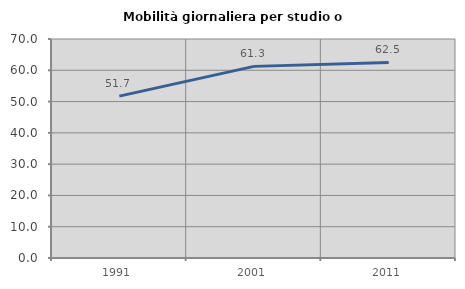
| Category | Mobilità giornaliera per studio o lavoro |
|---|---|
| 1991.0 | 51.736 |
| 2001.0 | 61.25 |
| 2011.0 | 62.5 |